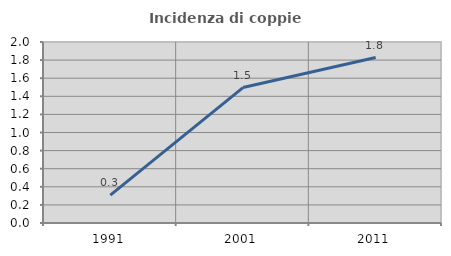
| Category | Incidenza di coppie miste |
|---|---|
| 1991.0 | 0.309 |
| 2001.0 | 1.497 |
| 2011.0 | 1.828 |